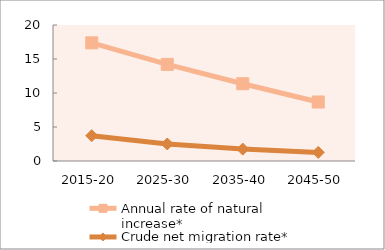
| Category | Annual rate of natural increase* | Crude net migration rate* |
|---|---|---|
| 2015-20 | 17.378 | 3.725 |
| 2025-30 | 14.201 | 2.503 |
| 2035-40 | 11.364 | 1.749 |
| 2045-50 | 8.678 | 1.265 |